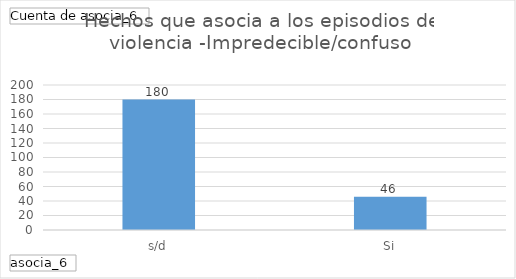
| Category | Total |
|---|---|
| s/d | 180 |
| Si | 46 |